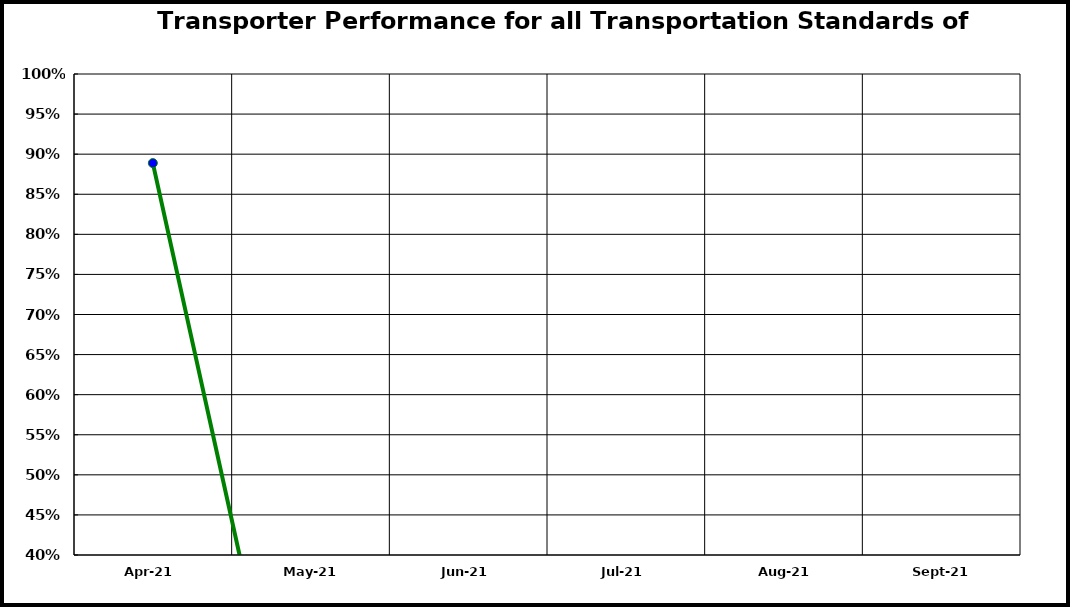
| Category | Performance |
|---|---|
| 2021-04-01 | 0.889 |
| 2021-05-01 | 0 |
| 2021-06-01 | 0 |
| 2021-07-01 | 0 |
| 2021-08-01 | 0 |
| 2021-09-01 | 0 |